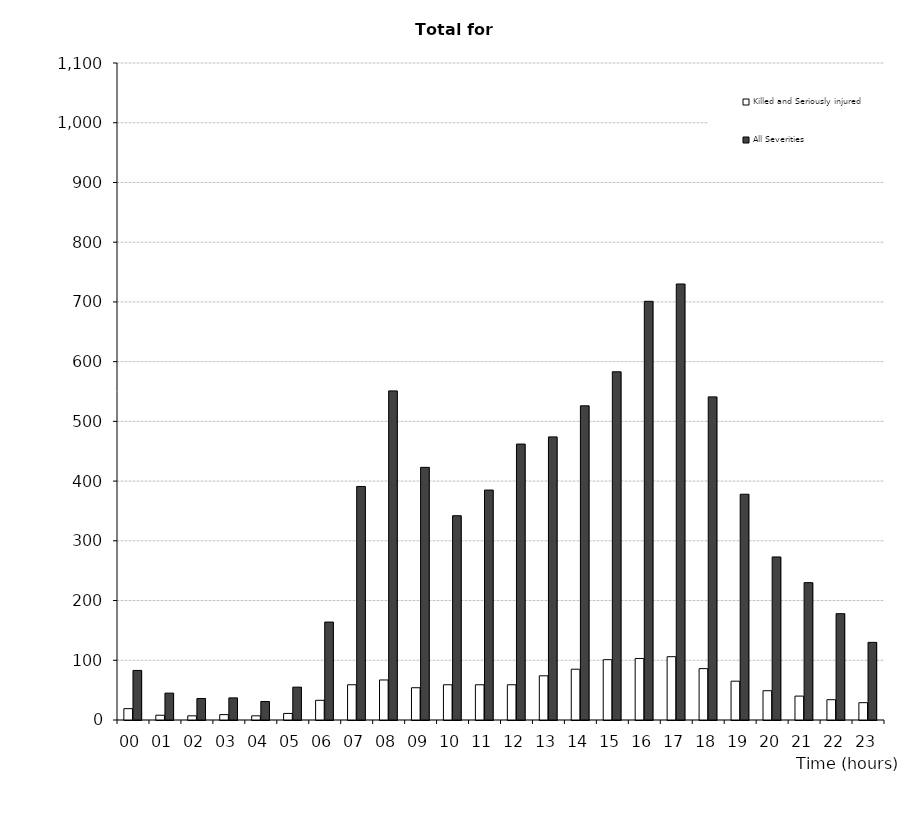
| Category | Killed and Seriously injured | All Severities |
|---|---|---|
| 00 | 19 | 83 |
| 01 | 8 | 45 |
| 02 | 7 | 36 |
| 03 | 9 | 37 |
| 04 | 7 | 31 |
| 05 | 11 | 55 |
| 06 | 33 | 164 |
| 07 | 59 | 391 |
| 08 | 67 | 551 |
| 09 | 54 | 423 |
| 10 | 59 | 342 |
| 11 | 59 | 385 |
| 12 | 59 | 462 |
| 13 | 74 | 474 |
| 14 | 85 | 526 |
| 15 | 101 | 583 |
| 16 | 103 | 701 |
| 17 | 106 | 730 |
| 18 | 86 | 541 |
| 19 | 65 | 378 |
| 20 | 49 | 273 |
| 21 | 40 | 230 |
| 22 | 34 | 178 |
| 23 | 29 | 130 |